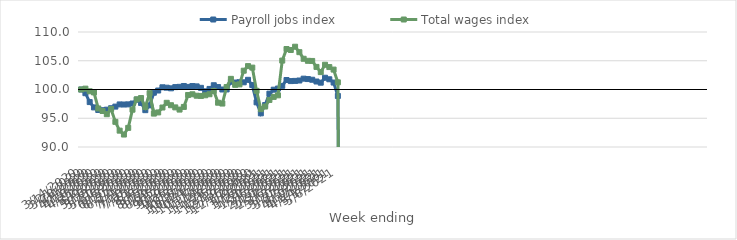
| Category | Payroll jobs index | Total wages index |
|---|---|---|
| 14/03/2020 | 100 | 100 |
| 21/03/2020 | 99.358 | 100.148 |
| 28/03/2020 | 97.812 | 99.688 |
| 04/04/2020 | 96.884 | 99.487 |
| 11/04/2020 | 96.436 | 96.703 |
| 18/04/2020 | 96.397 | 96.262 |
| 25/04/2020 | 96.492 | 95.706 |
| 02/05/2020 | 96.744 | 96.602 |
| 09/05/2020 | 97.027 | 94.376 |
| 16/05/2020 | 97.405 | 92.844 |
| 23/05/2020 | 97.387 | 92.166 |
| 30/05/2020 | 97.414 | 93.326 |
| 06/06/2020 | 97.564 | 96.492 |
| 13/06/2020 | 98.231 | 98.295 |
| 20/06/2020 | 97.664 | 98.515 |
| 27/06/2020 | 96.406 | 96.946 |
| 04/07/2020 | 97.241 | 99.362 |
| 11/07/2020 | 99.441 | 95.809 |
| 18/07/2020 | 99.822 | 96.01 |
| 25/07/2020 | 100.386 | 96.866 |
| 01/08/2020 | 100.317 | 97.686 |
| 08/08/2020 | 100.206 | 97.266 |
| 15/08/2020 | 100.417 | 96.89 |
| 22/08/2020 | 100.463 | 96.507 |
| 29/08/2020 | 100.611 | 96.969 |
| 05/09/2020 | 100.453 | 99.048 |
| 12/09/2020 | 100.602 | 99.17 |
| 19/09/2020 | 100.541 | 98.918 |
| 26/09/2020 | 100.29 | 98.875 |
| 03/10/2020 | 99.681 | 98.993 |
| 10/10/2020 | 100.1 | 99.177 |
| 17/10/2020 | 100.74 | 99.749 |
| 24/10/2020 | 100.424 | 97.702 |
| 31/10/2020 | 100.003 | 97.556 |
| 07/11/2020 | 100.013 | 100.426 |
| 14/11/2020 | 101.349 | 101.851 |
| 21/11/2020 | 101.208 | 100.808 |
| 28/11/2020 | 101.264 | 100.891 |
| 05/12/2020 | 101.252 | 103.27 |
| 12/12/2020 | 101.684 | 104.07 |
| 19/12/2020 | 100.77 | 103.807 |
| 26/12/2020 | 97.766 | 99.768 |
| 02/01/2021 | 95.856 | 96.578 |
| 09/01/2021 | 97.295 | 97.037 |
| 16/01/2021 | 99.279 | 98.182 |
| 23/01/2021 | 99.969 | 98.71 |
| 30/01/2021 | 100.168 | 98.984 |
| 06/02/2021 | 100.641 | 105.029 |
| 13/02/2021 | 101.651 | 107.042 |
| 20/02/2021 | 101.463 | 106.871 |
| 27/02/2021 | 101.495 | 107.44 |
| 06/03/2021 | 101.565 | 106.493 |
| 13/03/2021 | 101.884 | 105.343 |
| 20/03/2021 | 101.816 | 104.987 |
| 27/03/2021 | 101.697 | 104.967 |
| 03/04/2021 | 101.389 | 103.928 |
| 10/04/2021 | 101.185 | 103.022 |
| 17/04/2021 | 102.044 | 104.304 |
| 24/04/2021 | 101.778 | 103.902 |
| 01/05/2021 | 101.209 | 103.462 |
| 08/05/2021 | 98.875 | 101.247 |